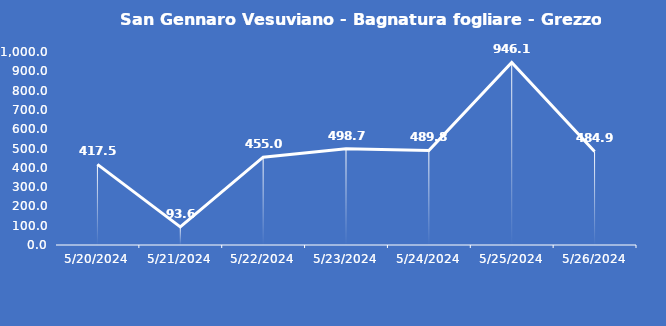
| Category | San Gennaro Vesuviano - Bagnatura fogliare - Grezzo (min) |
|---|---|
| 5/20/24 | 417.5 |
| 5/21/24 | 93.6 |
| 5/22/24 | 455 |
| 5/23/24 | 498.7 |
| 5/24/24 | 489.8 |
| 5/25/24 | 946.1 |
| 5/26/24 | 484.9 |